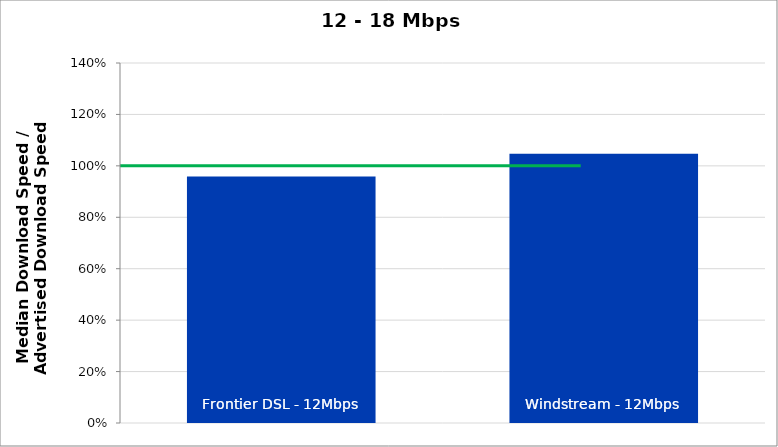
| Category | Series 0 |
|---|---|
| Frontier DSL - 12Mbps | 0.959 |
| Windstream - 12Mbps | 1.047 |